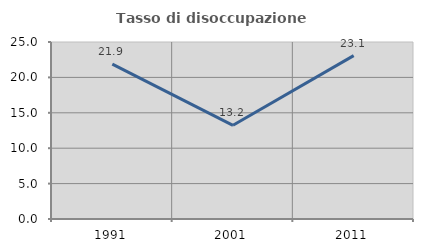
| Category | Tasso di disoccupazione giovanile  |
|---|---|
| 1991.0 | 21.884 |
| 2001.0 | 13.235 |
| 2011.0 | 23.077 |